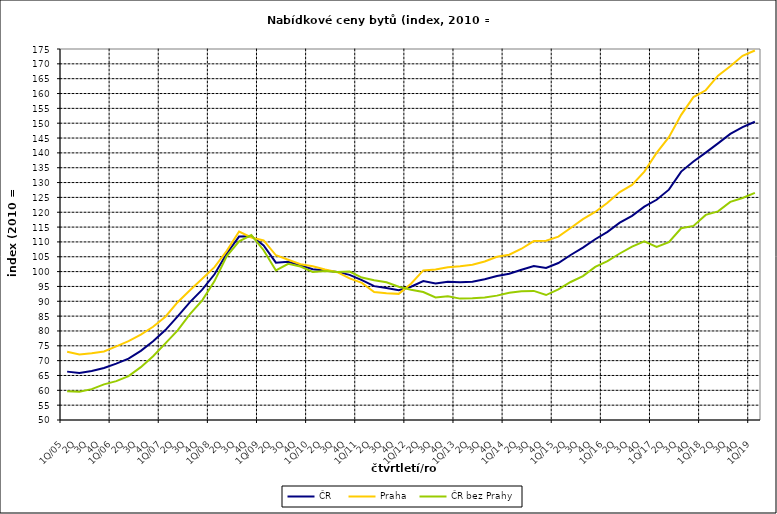
| Category | ČR  | Praha | ČR bez Prahy  |
|---|---|---|---|
| 1Q/05 | 66.3 | 73 | 59.7 |
| 2Q | 65.8 | 72.1 | 59.5 |
| 3Q | 66.5 | 72.5 | 60.4 |
| 4Q | 67.5 | 73.1 | 62 |
| 1Q/06 | 69 | 74.8 | 63.1 |
| 2Q | 70.7 | 76.6 | 64.8 |
| 3Q | 73.3 | 78.8 | 67.8 |
| 4Q | 76.5 | 81.4 | 71.5 |
| 1Q/07 | 80.3 | 84.8 | 75.8 |
| 2Q | 84.9 | 89.7 | 80.2 |
| 3Q | 89.7 | 93.7 | 85.7 |
| 4Q | 93.9 | 97.6 | 90.3 |
| 1Q/08 | 99.1 | 101.5 | 96.8 |
| 2Q | 106.1 | 107 | 105.2 |
| 3Q | 111.8 | 113.5 | 110.2 |
| 4Q | 111.9 | 111.5 | 112.3 |
| 1Q/09 | 108.8 | 110.5 | 107.2 |
| 2Q | 103 | 105.5 | 100.4 |
| 3Q | 103.3 | 104 | 102.6 |
| 4Q | 102.1 | 102.5 | 101.7 |
| 1Q/10 | 100.8 | 101.8 | 99.9 |
| 2Q | 100.4 | 100.7 | 100.2 |
| 3Q | 99.9 | 99.8 | 99.9 |
| 4Q | 98.9 | 97.7 | 100 |
| 1Q/11 | 97.1 | 96.2 | 98 |
| 2Q | 95.1 | 93.1 | 97.1 |
| 3Q | 94.5 | 92.7 | 96.4 |
| 4Q | 93.7 | 92.5 | 94.9 |
| 1Q/12 | 94.9 | 95.9 | 93.9 |
| 2Q | 96.8 | 100.4 | 93.1 |
| 3Q | 96 | 100.7 | 91.3 |
| 4Q | 96.6 | 101.5 | 91.7 |
| 1Q/13 | 96.4 | 101.8 | 90.9 |
| 2Q | 96.6 | 102.3 | 91 |
| 3Q | 97.4 | 103.4 | 91.3 |
| 4Q | 98.5 | 105 | 91.9 |
| 1Q/14 | 99.3 | 105.7 | 92.9 |
| 2Q | 100.6 | 107.7 | 93.4 |
| 3Q | 101.9 | 110.3 | 93.5 |
| 4Q | 101.2 | 110.4 | 92.1 |
| 1Q/15 | 102.9 | 111.8 | 94 |
| 2Q | 105.6 | 114.7 | 96.5 |
| 3Q | 108.1 | 117.7 | 98.5 |
| 4Q | 110.9 | 120.1 | 101.6 |
| 1Q/16 | 113.4 | 123.2 | 103.5 |
| 2Q | 116.5 | 126.8 | 106.1 |
| 3Q | 118.8 | 129.2 | 108.4 |
| 4Q | 121.9 | 133.7 | 110.2 |
| 1Q/17 | 124.2 | 140 | 108.3 |
| 2Q | 127.6 | 145.3 | 109.9 |
| 3Q | 133.7 | 152.8 | 114.6 |
| 4Q | 137.1 | 158.8 | 115.4 |
| 1Q/18 | 140.1 | 161.1 | 119.1 |
| 2Q | 143.2 | 166 | 120.3 |
| 3Q | 146.4 | 169.2 | 123.5 |
| 4Q | 148.7 | 172.7 | 124.8 |
| 1Q/19 | 150.5 | 174.5 | 126.5 |